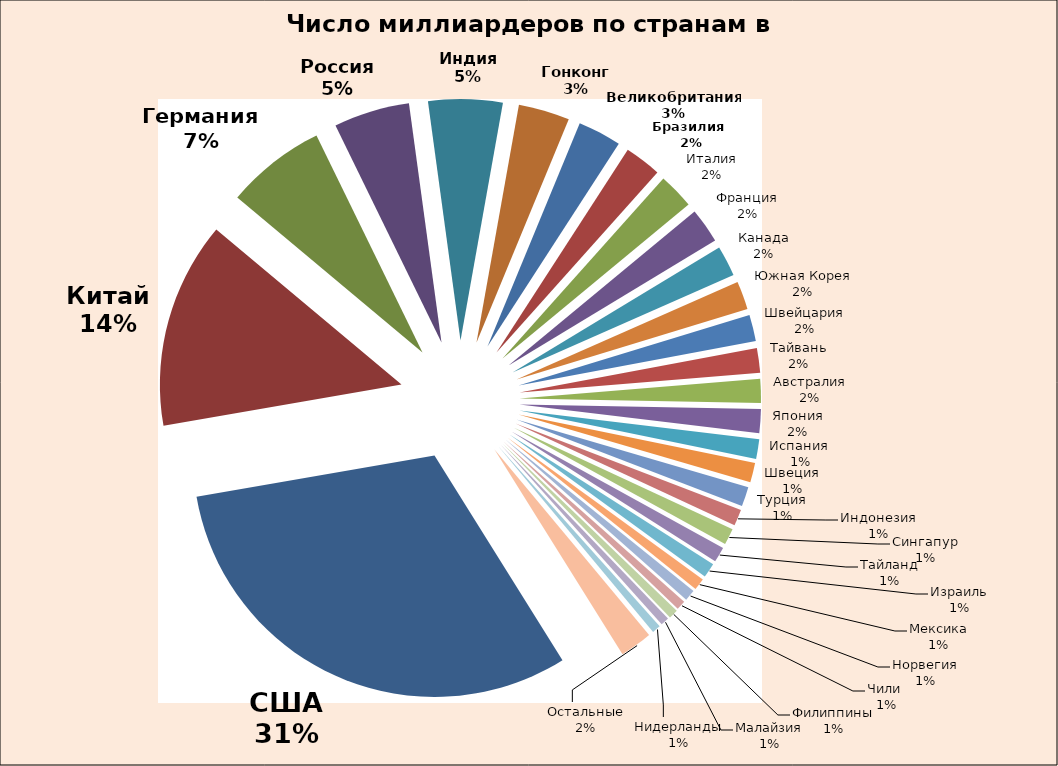
| Category | Series 0 |
|---|---|
| США | 546 |
| Китай | 242 |
| Германия | 117 |
| Россия | 89 |
| Индия | 87 |
| Гонконг | 60 |
| Великобритания | 51 |
| Бразилия  | 43 |
| Италия | 42 |
| Франция | 41 |
| Канада | 36 |
| Южная Корея | 33 |
| Швейцария | 31 |
| Тайвань | 29 |
| Австралия | 28 |
| Япония | 28 |
| Испания  | 23 |
| Швеция | 23 |
| Турция | 23 |
| Индонезия | 19 |
| Сингапур | 19 |
| Тайланд | 18 |
| Израиль | 17 |
| Мексика | 14 |
| Норвегия | 13 |
| Чили  | 11 |
| Филиппины | 11 |
| Малайзия | 10 |
| Нидерланды | 10 |
| Остальные | 38 |